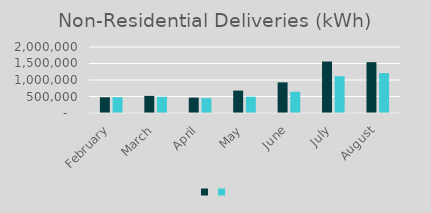
| Category | Series 1 | Series 0 |
|---|---|---|
| February | 476112 | 478521 |
| March | 518215 | 491644 |
| April | 465518 | 450294 |
| May | 679342 | 494447 |
| June | 927597 | 643205 |
| July | 1559898 | 1114742 |
| August | 1540109 | 1207707 |